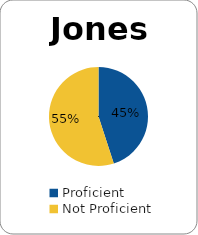
| Category | Series 0 |
|---|---|
| Proficient | 0.45 |
| Not Proficient | 0.55 |